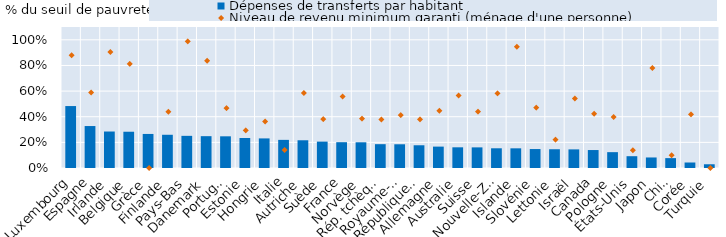
| Category | Dépenses de transferts par habitant |
|---|---|
| Luxembourg | 0.483 |
| Espagne | 0.327 |
| Irlande | 0.285 |
| Belgique | 0.283 |
| Grèce | 0.266 |
| Finlande | 0.259 |
| Pays-Bas | 0.251 |
| Danemark | 0.248 |
| Portugal | 0.247 |
| Estonie | 0.234 |
| Hongrie | 0.231 |
| Italie | 0.219 |
| Autriche | 0.216 |
| Suède | 0.206 |
| France | 0.201 |
| Norvège | 0.201 |
| Rép. tchèque | 0.186 |
| Royaume-Uni | 0.185 |
| République slovaque | 0.177 |
| Allemagne | 0.167 |
| Australie | 0.161 |
| Suisse | 0.161 |
| Nouvelle-Zélande | 0.154 |
| Islande | 0.154 |
| Slovénie | 0.148 |
| Lettonie | 0.146 |
| Israël | 0.145 |
| Canada | 0.14 |
| Pologne | 0.124 |
| États-Unis | 0.092 |
| Japon | 0.082 |
| Chili | 0.077 |
| Corée | 0.043 |
| Turquie | 0.029 |